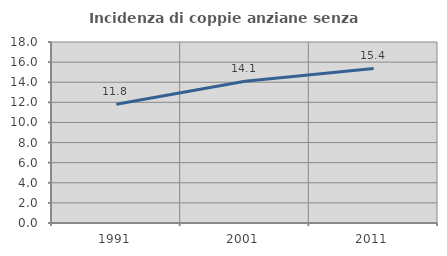
| Category | Incidenza di coppie anziane senza figli  |
|---|---|
| 1991.0 | 11.804 |
| 2001.0 | 14.097 |
| 2011.0 | 15.368 |